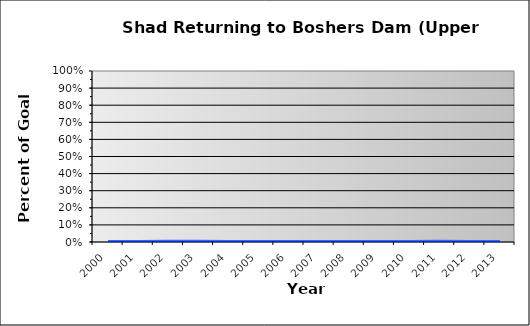
| Category | Boshers Dam Percent Achieved |
|---|---|
| 2000.0 | 0 |
| 2001.0 | 0 |
| 2002.0 | 0.001 |
| 2003.0 | 0.002 |
| 2004.0 | 0 |
| 2005.0 | 0 |
| 2006.0 | 0 |
| 2007.0 | 0 |
| 2008.0 | 0 |
| 2009.0 | 0 |
| 2010.0 | 0 |
| 2011.0 | 0.001 |
| 2012.0 | 0 |
| 2013.0 | 0 |